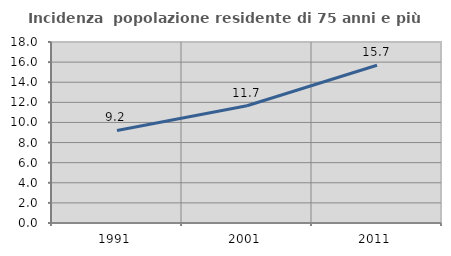
| Category | Incidenza  popolazione residente di 75 anni e più |
|---|---|
| 1991.0 | 9.208 |
| 2001.0 | 11.663 |
| 2011.0 | 15.689 |